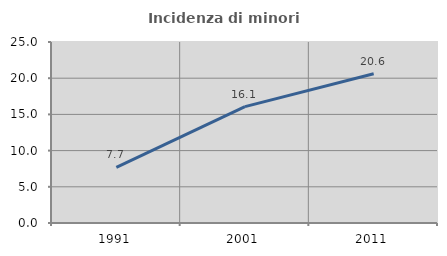
| Category | Incidenza di minori stranieri |
|---|---|
| 1991.0 | 7.692 |
| 2001.0 | 16.071 |
| 2011.0 | 20.606 |